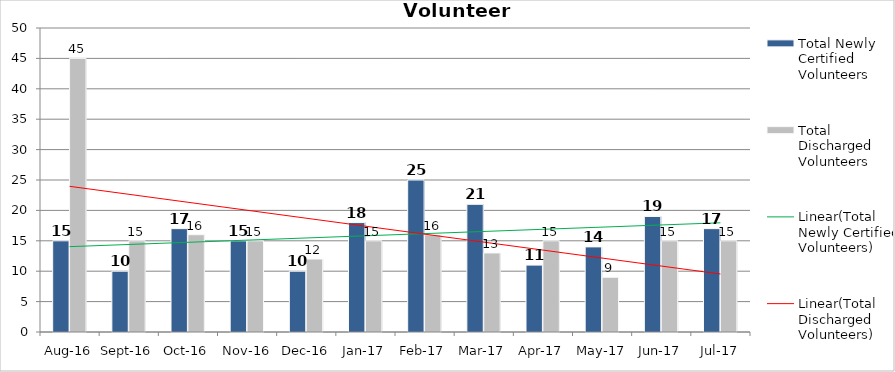
| Category | Total Newly Certified Volunteers | Total Discharged Volunteers |
|---|---|---|
| Aug-16 | 15 | 45 |
| Sep-16 | 10 | 15 |
| Oct-16 | 17 | 16 |
| Nov-16 | 15 | 15 |
| Dec-16 | 10 | 12 |
| Jan-17 | 18 | 15 |
| Feb-17 | 25 | 16 |
| Mar-17 | 21 | 13 |
| Apr-17 | 11 | 15 |
| May-17 | 14 | 9 |
| Jun-17 | 19 | 15 |
| Jul-17 | 17 | 15 |